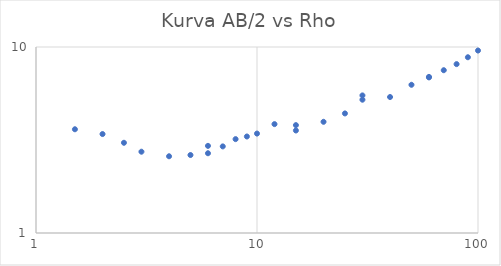
| Category | Series 0 |
|---|---|
| 1.5 | 3.612 |
| 2.0 | 3.404 |
| 2.5 | 3.055 |
| 3.0 | 2.736 |
| 4.0 | 2.585 |
| 5.0 | 2.625 |
| 6.0 | 2.94 |
| 6.0 | 2.684 |
| 7.0 | 2.921 |
| 8.0 | 3.197 |
| 9.0 | 3.302 |
| 10.0 | 3.424 |
| 12.0 | 3.849 |
| 15.0 | 3.802 |
| 15.0 | 3.557 |
| 20.0 | 3.961 |
| 25.0 | 4.394 |
| 30.0 | 5.492 |
| 30.0 | 5.208 |
| 40.0 | 5.384 |
| 50.0 | 6.264 |
| 60.0 | 6.864 |
| 60.0 | 6.907 |
| 70.0 | 7.503 |
| 80.0 | 8.09 |
| 90.0 | 8.809 |
| 100.0 | 9.572 |